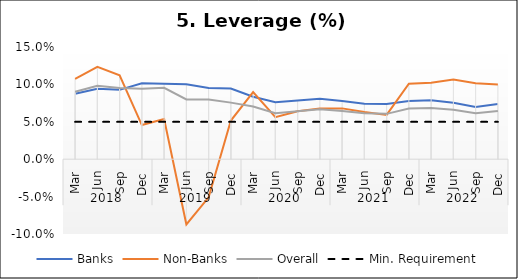
| Category | Banks | Non-Banks | Overall | Min. Requirement |
|---|---|---|---|---|
| 0 | 0.088 | 0.107 | 0.09 | 0.05 |
| 1 | 0.094 | 0.123 | 0.098 | 0.05 |
| 2 | 0.093 | 0.112 | 0.095 | 0.05 |
| 3 | 0.102 | 0.046 | 0.094 | 0.05 |
| 4 | 0.101 | 0.054 | 0.095 | 0.05 |
| 5 | 0.1 | -0.087 | 0.08 | 0.05 |
| 6 | 0.095 | -0.051 | 0.08 | 0.05 |
| 7 | 0.095 | 0.052 | 0.076 | 0.05 |
| 8 | 0.084 | 0.09 | 0.07 | 0.05 |
| 9 | 0.076 | 0.056 | 0.062 | 0.05 |
| 10 | 0.079 | 0.064 | 0.064 | 0.05 |
| 11 | 0.081 | 0.068 | 0.067 | 0.05 |
| 12 | 0.078 | 0.068 | 0.064 | 0.05 |
| 13 | 0.074 | 0.063 | 0.061 | 0.05 |
| 14 | 0.074 | 0.059 | 0.061 | 0.05 |
| 15 | 0.078 | 0.101 | 0.068 | 0.05 |
| 16 | 0.079 | 0.102 | 0.068 | 0.05 |
| 17 | 0.075 | 0.106 | 0.066 | 0.05 |
| 18 | 0.07 | 0.102 | 0.061 | 0.05 |
| 19 | 0.074 | 0.1 | 0.064 | 0.05 |